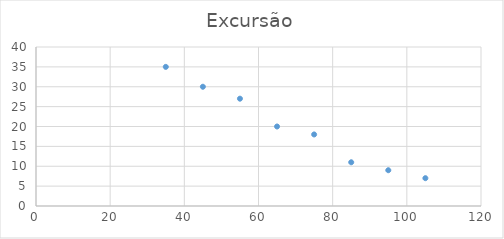
| Category | Excursão |
|---|---|
| 35.0 | 35 |
| 45.0 | 30 |
| 55.0 | 27 |
| 65.0 | 20 |
| 75.0 | 18 |
| 85.0 | 11 |
| 95.0 | 9 |
| 105.0 | 7 |